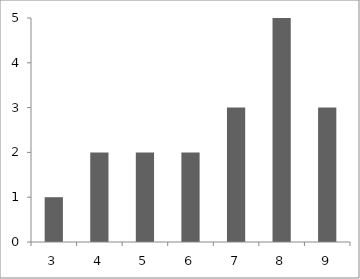
| Category | Series 0 |
|---|---|
| 3.0 | 1 |
| 4.0 | 2 |
| 5.0 | 2 |
| 6.0 | 2 |
| 7.0 | 3 |
| 8.0 | 5 |
| 9.0 | 3 |